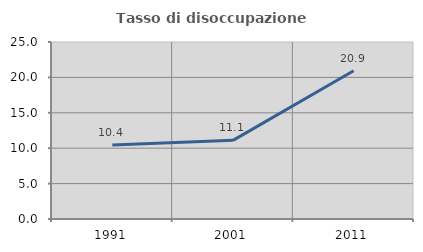
| Category | Tasso di disoccupazione giovanile  |
|---|---|
| 1991.0 | 10.448 |
| 2001.0 | 11.111 |
| 2011.0 | 20.93 |